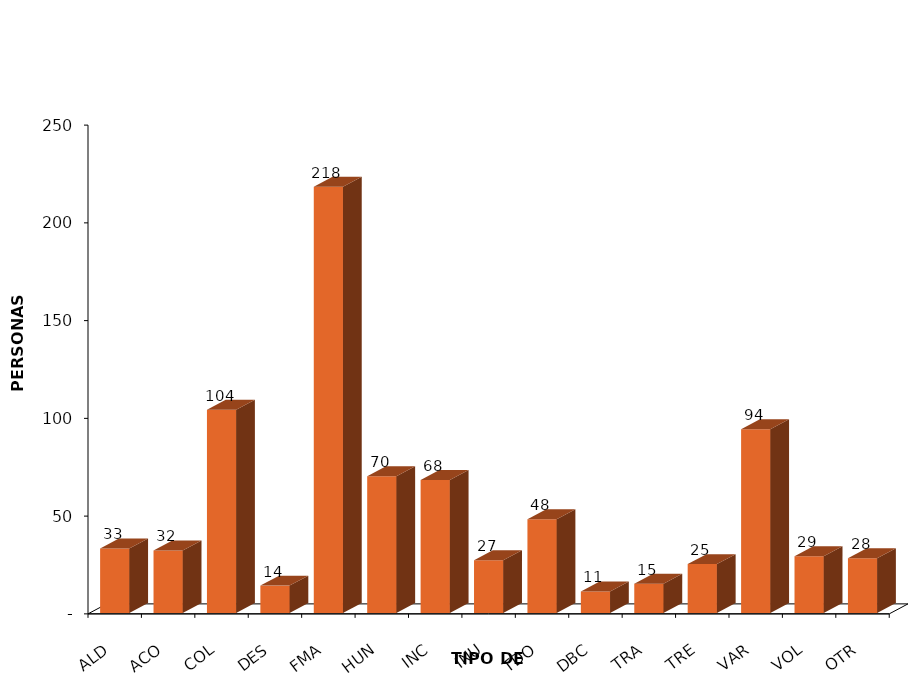
| Category | Series 0 |
|---|---|
| ALD | 33 |
| ACO | 32 |
| COL | 104 |
| DES | 14 |
| FMA | 218 |
| HUN | 70 |
| INC | 68 |
| INU | 27 |
| TDO | 48 |
| DBC | 11 |
| TRA | 15 |
| TRE | 25 |
| VAR | 94 |
| VOL | 29 |
| OTR | 28 |